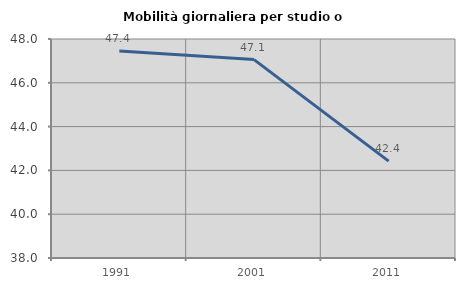
| Category | Mobilità giornaliera per studio o lavoro |
|---|---|
| 1991.0 | 47.447 |
| 2001.0 | 47.059 |
| 2011.0 | 42.424 |